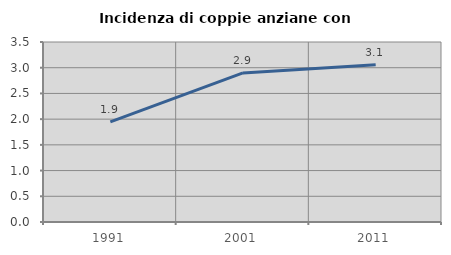
| Category | Incidenza di coppie anziane con figli |
|---|---|
| 1991.0 | 1.947 |
| 2001.0 | 2.898 |
| 2011.0 | 3.057 |